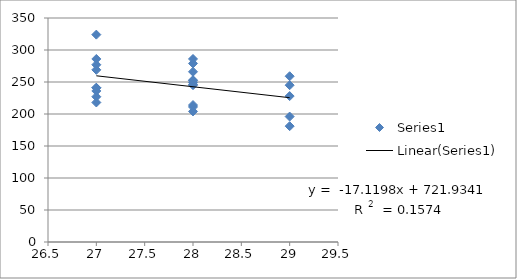
| Category | Series 0 |
|---|---|
| 27.0 | 277 |
| 28.0 | 214 |
| 28.0 | 266 |
| 28.0 | 249 |
| 29.0 | 181 |
| 29.0 | 259 |
| 29.0 | 245 |
| 27.0 | 218 |
| 27.0 | 236 |
| 27.0 | 324 |
| 27.0 | 227 |
| 27.0 | 241 |
| 28.0 | 245 |
| 28.0 | 246 |
| 28.0 | 286 |
| 27.0 | 269 |
| 27.0 | 286 |
| 28.0 | 253 |
| 28.0 | 204 |
| 29.0 | 196 |
| 27.0 | 241 |
| 28.0 | 279 |
| 28.0 | 252 |
| 28.0 | 211 |
| 29.0 | 228 |